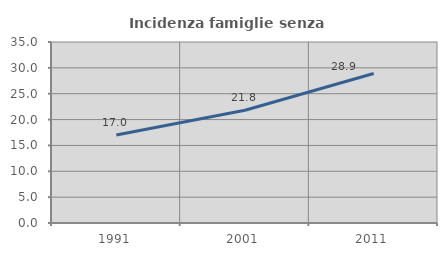
| Category | Incidenza famiglie senza nuclei |
|---|---|
| 1991.0 | 17.007 |
| 2001.0 | 21.806 |
| 2011.0 | 28.909 |